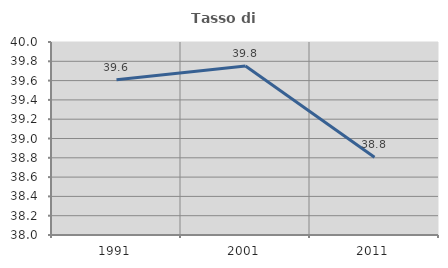
| Category | Tasso di occupazione   |
|---|---|
| 1991.0 | 39.61 |
| 2001.0 | 39.751 |
| 2011.0 | 38.805 |